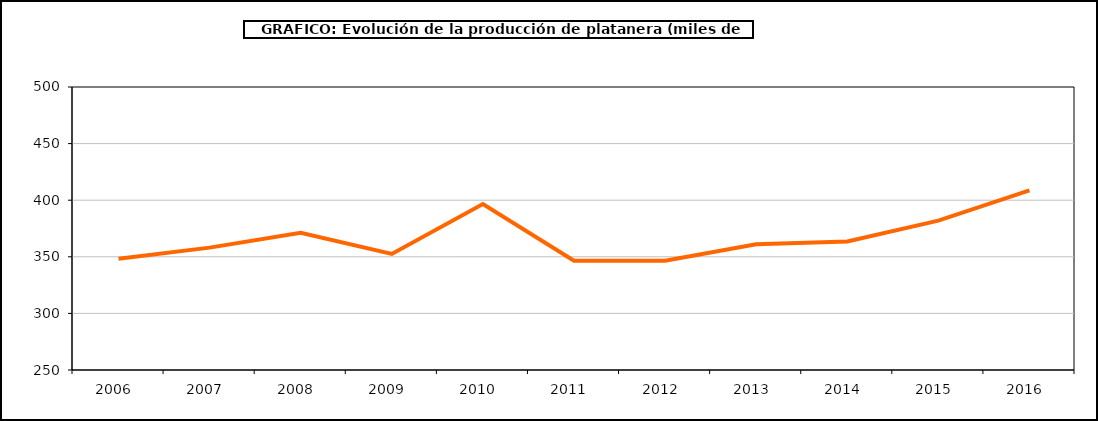
| Category | producción platanera |
|---|---|
| 2006.0 | 348.368 |
| 2007.0 | 358.117 |
| 2008.0 | 371.228 |
| 2009.0 | 352.522 |
| 2010.0 | 396.589 |
| 2011.0 | 346.509 |
| 2012.0 | 346.509 |
| 2013.0 | 360.987 |
| 2014.0 | 363.552 |
| 2015.0 | 381.983 |
| 2016.0 | 408.716 |